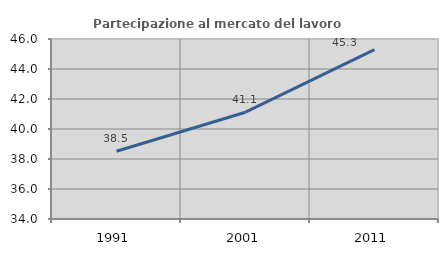
| Category | Partecipazione al mercato del lavoro  femminile |
|---|---|
| 1991.0 | 38.514 |
| 2001.0 | 41.118 |
| 2011.0 | 45.289 |